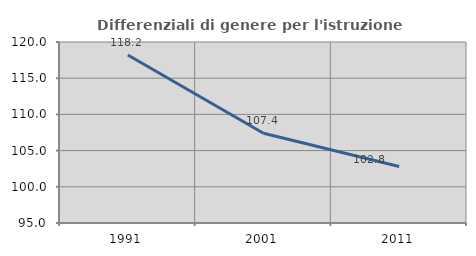
| Category | Differenziali di genere per l'istruzione superiore |
|---|---|
| 1991.0 | 118.204 |
| 2001.0 | 107.406 |
| 2011.0 | 102.799 |